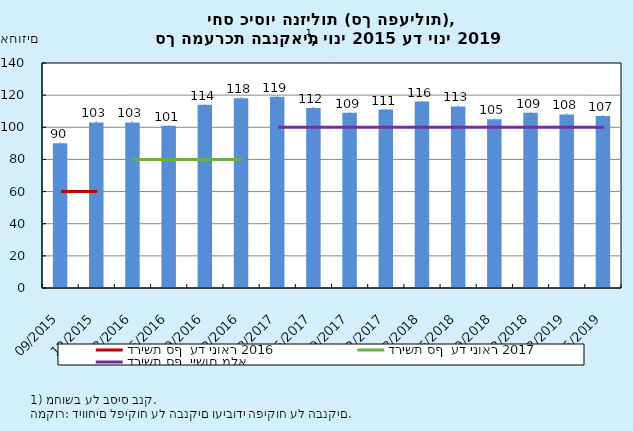
| Category | יחס כיסוי הנזילות יחסי נזילות- יתרות משוקללות במטבע ישראלי |
|---|---|
| 2015-09-30 | 90 |
| 2015-12-31 | 103 |
| 2016-03-31 | 103 |
| 2016-06-30 | 101 |
| 2016-09-30 | 114 |
| 2016-12-31 | 118 |
| 2017-03-31 | 119 |
| 2017-06-30 | 112 |
| 2017-09-30 | 109 |
| 2017-12-31 | 111 |
| 2018-03-31 | 116 |
| 2018-06-30 | 113 |
| 2018-09-30 | 105 |
| 2018-12-31 | 109 |
| 2019-03-31 | 108 |
| 2019-06-30 | 107 |